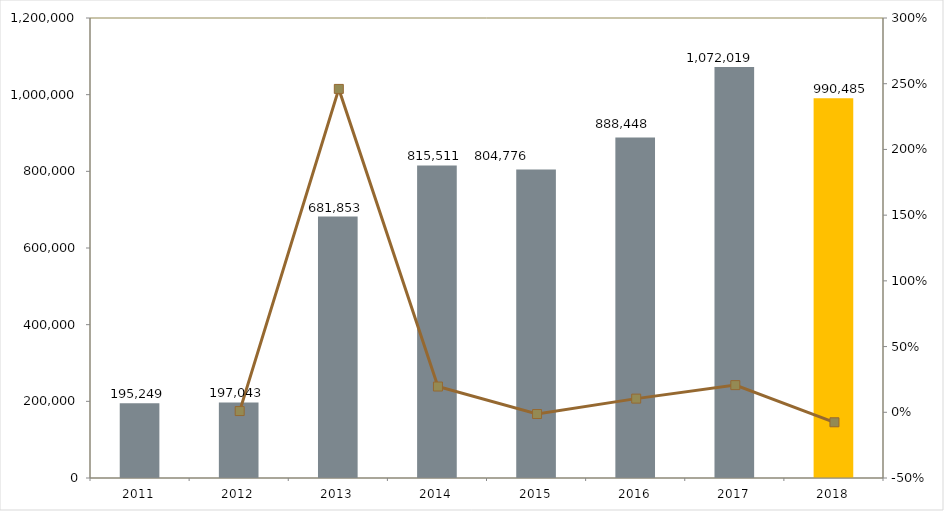
| Category | Series 0 |
|---|---|
| 2011.0 | 195249 |
| 2012.0 | 197043 |
| 2013.0 | 681853 |
| 2014.0 | 815511 |
| 2015.0 | 804776 |
| 2016.0 | 888448 |
| 2017.0 | 1072019 |
| 2018.0 | 990485 |